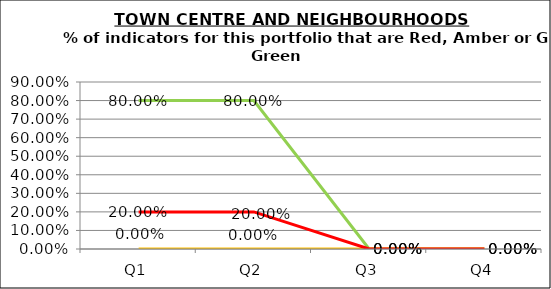
| Category | Green | Amber | Red |
|---|---|---|---|
| Q1 | 0.8 | 0 | 0.2 |
| Q2 | 0.8 | 0 | 0.2 |
| Q3 | 0 | 0 | 0 |
| Q4 | 0 | 0 | 0 |